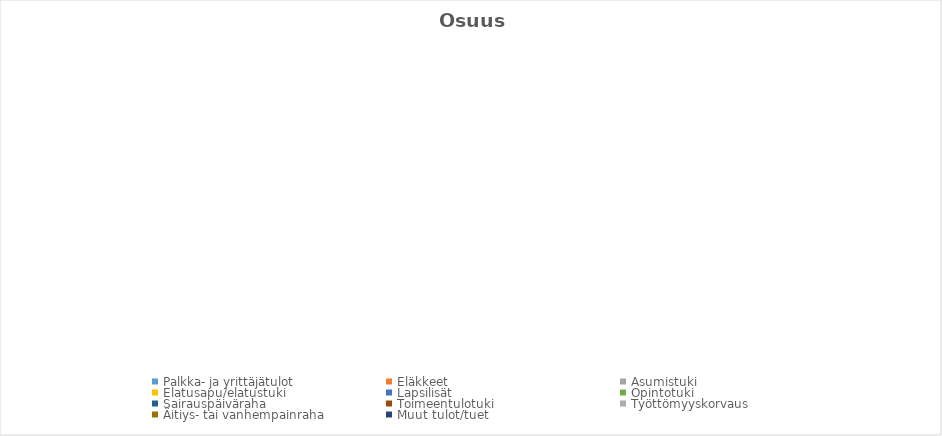
| Category | Series 0 |
|---|---|
| Palkka- ja yrittäjätulot | 0 |
| Eläkkeet | 0 |
| Asumistuki | 0 |
| Elatusapu/elatustuki | 0 |
| Lapsilisät | 0 |
| Opintotuki | 0 |
| Sairauspäiväraha | 0 |
| Toimeentulotuki | 0 |
| Työttömyyskorvaus | 0 |
| Äitiys- tai vanhempainraha | 0 |
| Muut tulot/tuet | 0 |